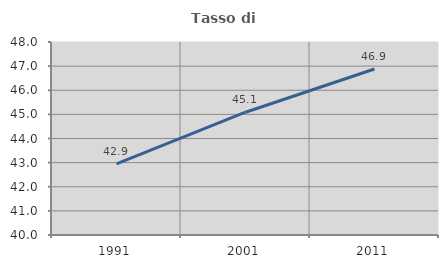
| Category | Tasso di occupazione   |
|---|---|
| 1991.0 | 42.945 |
| 2001.0 | 45.09 |
| 2011.0 | 46.881 |